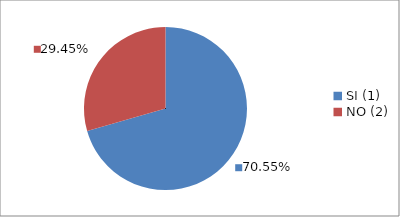
| Category | Series 0 |
|---|---|
| SI (1) | 0.706 |
| NO (2) | 0.294 |